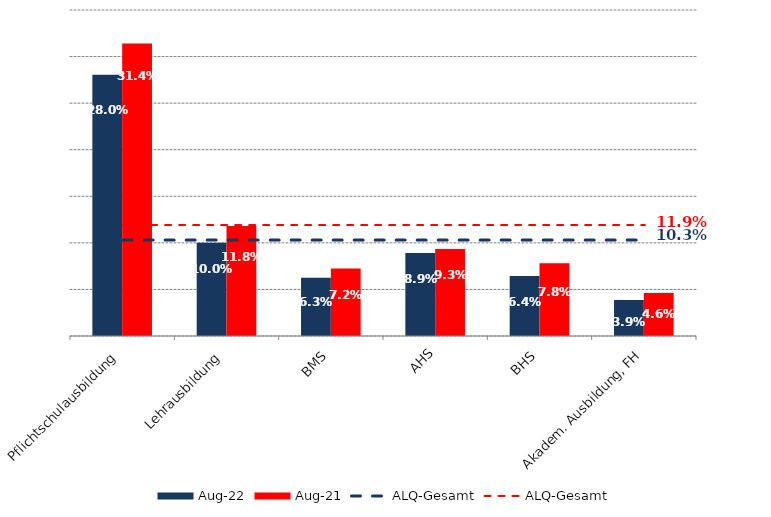
| Category | Aug 22 | Aug 21 |
|---|---|---|
| Pflichtschulausbildung | 0.28 | 0.314 |
| Lehrausbildung | 0.1 | 0.118 |
| BMS | 0.063 | 0.072 |
| AHS | 0.089 | 0.093 |
| BHS | 0.064 | 0.078 |
| Akadem. Ausbildung, FH | 0.039 | 0.046 |